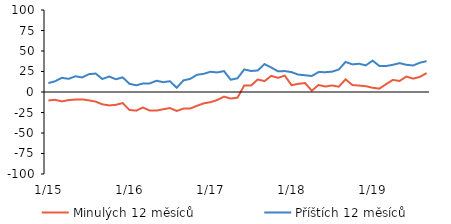
| Category | Minulých 12 měsíců | Příštích 12 měsíců |
|---|---|---|
|  1/15 | -10.32 | 10.88 |
|  2/15 | -9.55 | 13.1 |
|  3/15 | -11.45 | 17.32 |
|  4/15 | -9.85 | 16.04 |
|  5/15 | -9.22 | 19.19 |
|  6/15 | -8.99 | 17.77 |
|  7/15 | -10.2 | 21.74 |
|  8/15 | -11.76 | 22.49 |
|  9/15 | -15.03 | 15.86 |
|  10/15 | -16.38 | 18.89 |
|  11/15 | -15.64 | 15.55 |
|  12/15 | -13.49 | 17.84 |
|  1/16 | -21.91 | 10.03 |
|  2/16 | -22.72 | 8.16 |
|  3/16 | -18.91 | 10.34 |
|  4/16 | -22.65 | 10.48 |
|  5/16 | -22.69 | 13.73 |
|  6/16 | -21.05 | 11.99 |
|  7/16 | -19.56 | 13.15 |
|  8/16 | -23.1 | 5.15 |
|  9/16 | -20.21 | 14.17 |
|  10/16 | -20.19 | 16 |
|  11/16 | -16.81 | 20.99 |
|  12/16 | -13.84 | 22.19 |
|  1/17 | -12.4 | 24.7 |
|  2/17 | -9.79 | 23.87 |
|  3/17 | -5.67 | 25.48 |
|  4/17 | -8.04 | 14.94 |
|  5/17 | -6.9 | 16.78 |
|  6/17 | 7.95 | 27.5 |
|  7/17 | 7.9 | 25.66 |
|  8/17 | 15.28 | 26.2 |
|  9/17 | 13.3 | 34.02 |
|  10/17 | 19.64 | 29.89 |
|  11/17 | 17.29 | 25.16 |
|  12/17 | 20.01 | 25.53 |
|  1/18 | 8.26 | 24.23 |
|  2/18 | 9.94 | 21.21 |
|  3/18 | 10.91 | 20.44 |
|  4/18 | 1.56 | 19.52 |
|  5/18 | 8.57 | 24.34 |
|  6/18 | 6.65 | 24.16 |
|  7/18 | 8.04 | 24.79 |
|  8/18 | 6.42 | 27.41 |
|  9/18 | 15.48 | 36.69 |
|  10/18 | 8.47 | 33.68 |
|  11/18 | 7.83 | 34.44 |
|  12/18 | 7.09 | 32.48 |
|  1/19 | 5.17 | 38.27 |
|  2/19 | 4.08 | 31.81 |
|  3/19 | 9.64 | 31.65 |
|  4/19 | 14.75 | 33.17 |
|  5/19 | 13.42 | 35.21 |
|  6/19 | 18.83 | 33.2 |
|  7/19 | 16.3 | 32.33 |
|  8/19 | 18.42 | 35.7 |
|  9/19 | 23.07 | 37.61 |